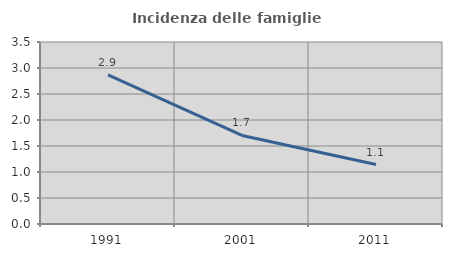
| Category | Incidenza delle famiglie numerose |
|---|---|
| 1991.0 | 2.868 |
| 2001.0 | 1.702 |
| 2011.0 | 1.144 |